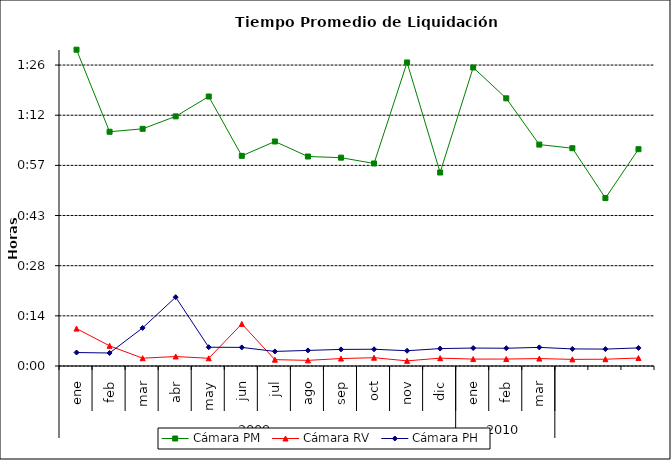
| Category | Cámara PM | Cámara RV | Cámara PH |
|---|---|---|---|
| 0 | 0.063 | 0.007 | 0.003 |
| 1 | 0.047 | 0.004 | 0.003 |
| 2 | 0.047 | 0.002 | 0.008 |
| 3 | 0.05 | 0.002 | 0.014 |
| 4 | 0.054 | 0.002 | 0.004 |
| 5 | 0.042 | 0.008 | 0.004 |
| 6 | 0.045 | 0.001 | 0.003 |
| 7 | 0.042 | 0.001 | 0.003 |
| 8 | 0.042 | 0.001 | 0.003 |
| 9 | 0.04 | 0.002 | 0.003 |
| 10 | 0.061 | 0.001 | 0.003 |
| 11 | 0.039 | 0.002 | 0.003 |
| 12 | 0.06 | 0.001 | 0.004 |
| 13 | 0.053 | 0.001 | 0.004 |
| 14 | 0.044 | 0.001 | 0.004 |
| 15 | 0.043 | 0.001 | 0.003 |
| 16 | 0.033 | 0.001 | 0.003 |
| 17 | 0.043 | 0.002 | 0.004 |